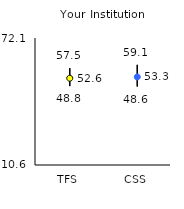
| Category | 25th | 75th | Mean |
|---|---|---|---|
| TFS | 48.8 | 57.5 | 52.61 |
| CSS | 48.6 | 59.1 | 53.25 |